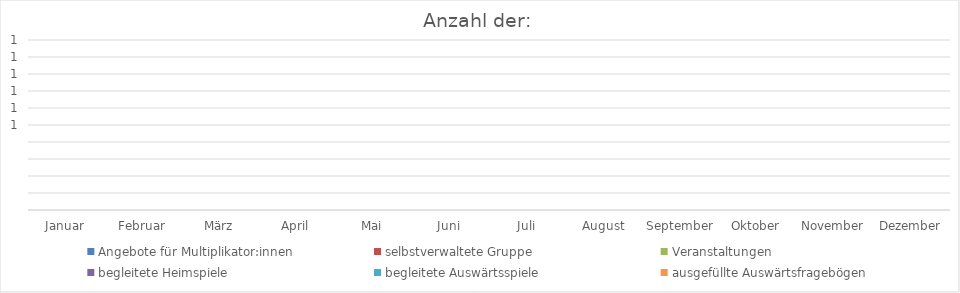
| Category | Angebote für Multiplikator:innen | selbstverwaltete Gruppe | Veranstaltungen | begleitete Heimspiele | begleitete Auswärtsspiele | ausgefüllte Auswärtsfragebögen |
|---|---|---|---|---|---|---|
| Januar | 0 | 0 | 0 | 0 | 0 | 0 |
| Februar | 0 | 0 | 0 | 0 | 0 | 0 |
| März | 0 | 0 | 0 | 0 | 0 | 0 |
| April | 0 | 0 | 0 | 0 | 0 | 0 |
| Mai | 0 | 0 | 0 | 0 | 0 | 0 |
| Juni | 0 | 0 | 0 | 0 | 0 | 0 |
| Juli | 0 | 0 | 0 | 0 | 0 | 0 |
| August | 0 | 0 | 0 | 0 | 0 | 0 |
| September | 0 | 0 | 0 | 0 | 0 | 0 |
| Oktober | 0 | 0 | 0 | 0 | 0 | 0 |
| November | 0 | 0 | 0 | 0 | 0 | 0 |
| Dezember | 0 | 0 | 0 | 0 | 0 | 0 |